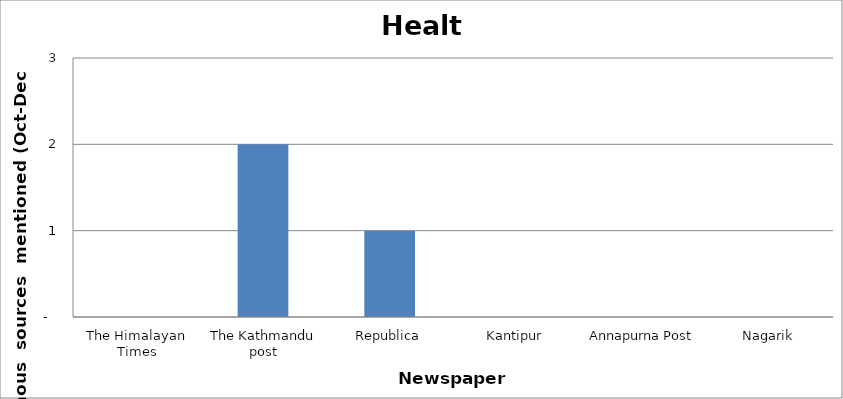
| Category | Health |
|---|---|
| The Himalayan Times | 0 |
| The Kathmandu post | 2 |
| Republica | 1 |
| Kantipur | 0 |
| Annapurna Post | 0 |
| Nagarik | 0 |